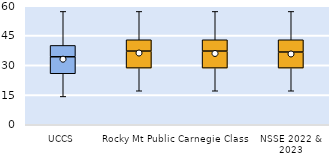
| Category | 25th | 50th | 75th |
|---|---|---|---|
| UCCS | 25.714 | 8.571 | 5.714 |
| Rocky Mt Public | 28.571 | 8.571 | 5.714 |
| Carnegie Class | 28.571 | 8.571 | 5.714 |
| NSSE 2022 & 2023 | 28.571 | 8.095 | 6.19 |